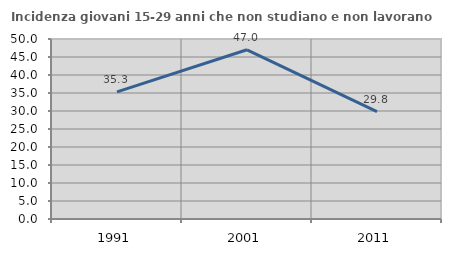
| Category | Incidenza giovani 15-29 anni che non studiano e non lavorano  |
|---|---|
| 1991.0 | 35.306 |
| 2001.0 | 47 |
| 2011.0 | 29.825 |